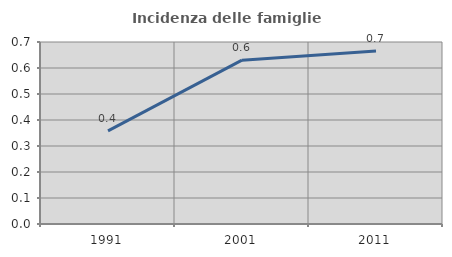
| Category | Incidenza delle famiglie numerose |
|---|---|
| 1991.0 | 0.358 |
| 2001.0 | 0.63 |
| 2011.0 | 0.665 |